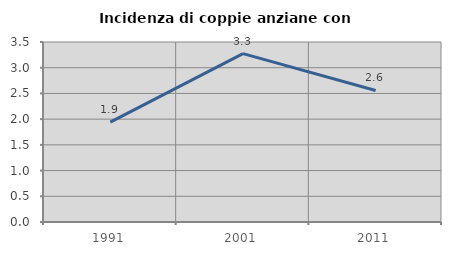
| Category | Incidenza di coppie anziane con figli |
|---|---|
| 1991.0 | 1.942 |
| 2001.0 | 3.274 |
| 2011.0 | 2.558 |